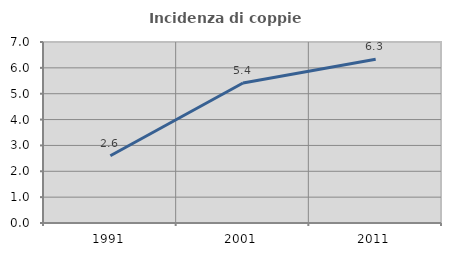
| Category | Incidenza di coppie miste |
|---|---|
| 1991.0 | 2.601 |
| 2001.0 | 5.412 |
| 2011.0 | 6.334 |